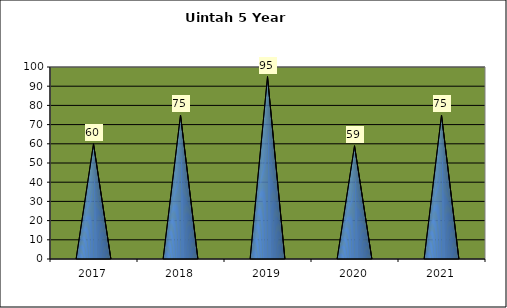
| Category | Washington Terrace April Comparison |
|---|---|
| 0 | 60 |
| 1 | 75 |
| 2 | 95 |
| 3 | 59 |
| 4 | 75 |